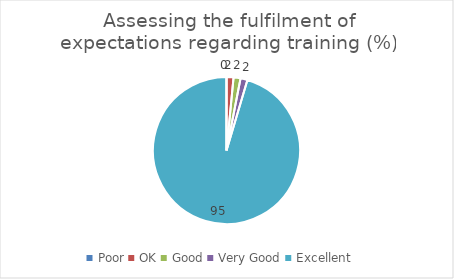
| Category | Assessing the fulfilment of expectations regarding training (%) |
|---|---|
| Poor | 0 |
| OK | 1.53 |
| Good | 1.53 |
| Very Good | 1.53 |
| Excellent | 95.38 |